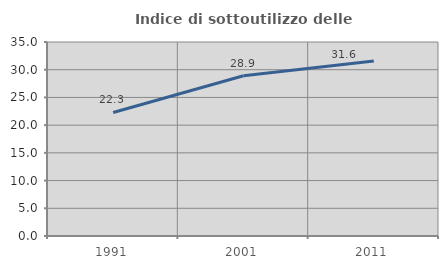
| Category | Indice di sottoutilizzo delle abitazioni  |
|---|---|
| 1991.0 | 22.283 |
| 2001.0 | 28.903 |
| 2011.0 | 31.561 |